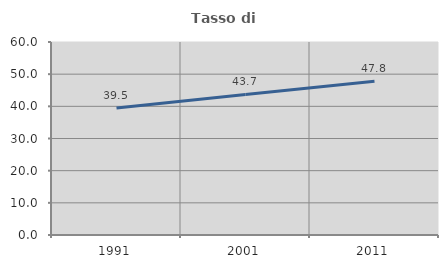
| Category | Tasso di occupazione   |
|---|---|
| 1991.0 | 39.454 |
| 2001.0 | 43.702 |
| 2011.0 | 47.803 |